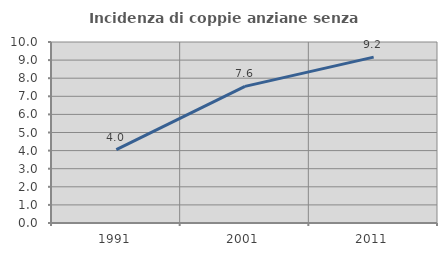
| Category | Incidenza di coppie anziane senza figli  |
|---|---|
| 1991.0 | 4.049 |
| 2001.0 | 7.55 |
| 2011.0 | 9.163 |